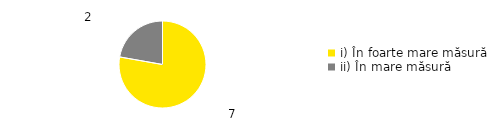
| Category | Total |
|---|---|
| i) În foarte mare măsură | 0.778 |
| ii) În mare măsură | 0.222 |